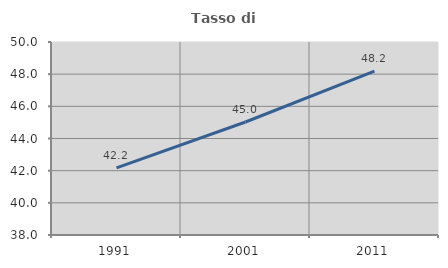
| Category | Tasso di occupazione   |
|---|---|
| 1991.0 | 42.176 |
| 2001.0 | 45.025 |
| 2011.0 | 48.192 |